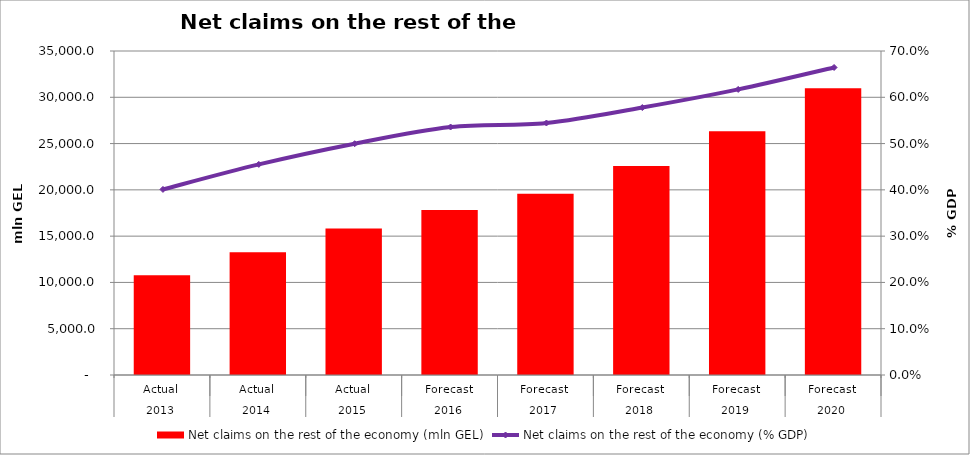
| Category | Net claims on the rest of the economy (mln GEL) |
|---|---|
| 0 | 10764.938 |
| 1 | 13263.115 |
| 2 | 15836.299 |
| 3 | 17822.75 |
| 4 | 19588.7 |
| 5 | 22590.03 |
| 6 | 26337.69 |
| 7 | 30965.09 |